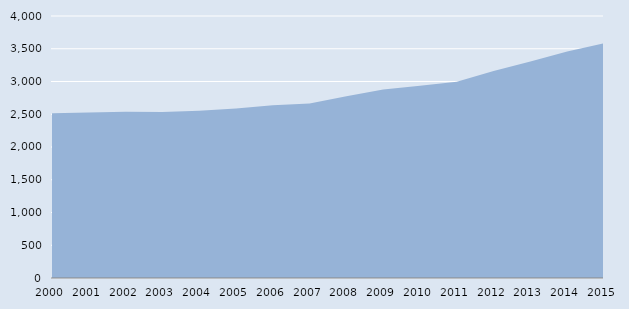
| Category | Series 0 |
|---|---|
| 2000.0 | 2514 |
| 2001.0 | 2526 |
| 2002.0 | 2539 |
| 2003.0 | 2533 |
| 2004.0 | 2552 |
| 2005.0 | 2589 |
| 2006.0 | 2639 |
| 2007.0 | 2664 |
| 2008.0 | 2774 |
| 2009.0 | 2876 |
| 2010.0 | 2936 |
| 2011.0 | 2998 |
| 2012.0 | 3159 |
| 2013.0 | 3307 |
| 2014.0 | 3457 |
| 2015.0 | 3583 |